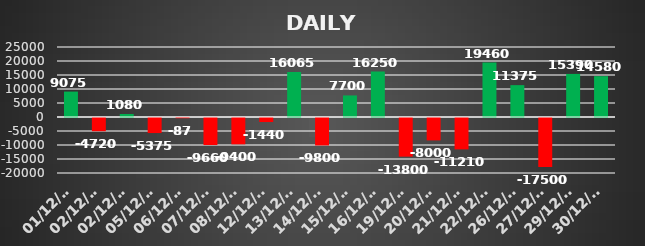
| Category | Series 0 |
|---|---|
| 2022-12-01 | 9075 |
| 2022-12-02 | -4720 |
| 2022-12-02 | 1080 |
| 2022-12-05 | -5375 |
| 2022-12-06 | -87.5 |
| 2022-12-07 | -9660 |
| 2022-12-08 | -9400 |
| 2022-12-12 | -1440 |
| 2022-12-13 | 16065 |
| 2022-12-14 | -9800 |
| 2022-12-15 | 7700 |
| 2022-12-16 | 16250 |
| 2022-12-19 | -13800 |
| 2022-12-20 | -8000 |
| 2022-12-21 | -11210 |
| 2022-12-22 | 19460 |
| 2022-12-26 | 11375 |
| 2022-12-27 | -17500 |
| 2022-12-29 | 15390 |
| 2022-12-30 | 14580 |